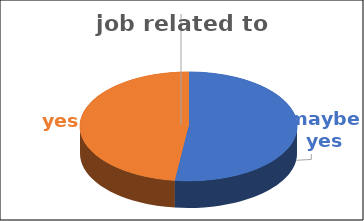
| Category | job related to studies | Series 1 | Series 2 | Series 3 | Series 4 |
|---|---|---|---|---|---|
| maybe yes | 0.52 |  |  |  |  |
| yes | 0.48 |  |  |  |  |